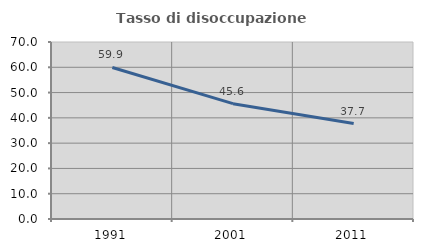
| Category | Tasso di disoccupazione giovanile  |
|---|---|
| 1991.0 | 59.934 |
| 2001.0 | 45.614 |
| 2011.0 | 37.736 |